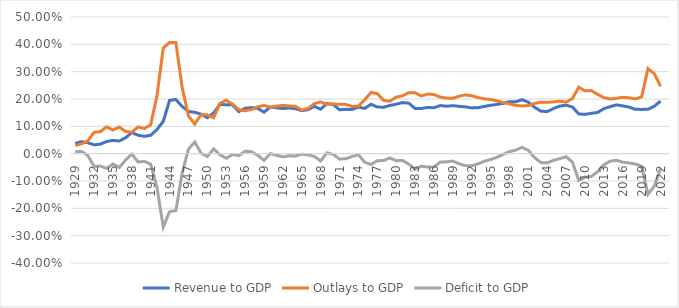
| Category | Revenue to GDP | Outlays to GDP | Deficit to GDP |
|---|---|---|---|
| 1929 | 0.037 | 0.03 | 0.007 |
| 1930 | 0.044 | 0.036 | 0.008 |
| 1931 | 0.04 | 0.046 | -0.006 |
| 1932 | 0.032 | 0.078 | -0.046 |
| 1933 | 0.035 | 0.08 | -0.045 |
| 1934 | 0.044 | 0.098 | -0.054 |
| 1935 | 0.049 | 0.086 | -0.038 |
| 1936 | 0.046 | 0.097 | -0.051 |
| 1937 | 0.058 | 0.082 | -0.024 |
| 1938 | 0.077 | 0.078 | -0.001 |
| 1939 | 0.067 | 0.098 | -0.03 |
| 1940 | 0.064 | 0.092 | -0.028 |
| 1941 | 0.067 | 0.106 | -0.038 |
| 1942 | 0.088 | 0.212 | -0.124 |
| 1943 | 0.118 | 0.387 | -0.269 |
| 1944 | 0.195 | 0.407 | -0.212 |
| 1945 | 0.198 | 0.407 | -0.209 |
| 1946 | 0.173 | 0.243 | -0.07 |
| 1947 | 0.154 | 0.138 | 0.016 |
| 1948 | 0.151 | 0.108 | 0.043 |
| 1949 | 0.145 | 0.143 | 0.002 |
| 1950 | 0.132 | 0.142 | -0.01 |
| 1951 | 0.149 | 0.131 | 0.018 |
| 1952 | 0.18 | 0.184 | -0.004 |
| 1953 | 0.179 | 0.196 | -0.017 |
| 1954 | 0.178 | 0.181 | -0.003 |
| 1955 | 0.154 | 0.161 | -0.007 |
| 1956 | 0.166 | 0.157 | 0.009 |
| 1957 | 0.169 | 0.162 | 0.007 |
| 1958 | 0.165 | 0.171 | -0.006 |
| 1959 | 0.152 | 0.177 | -0.025 |
| 1960 | 0.171 | 0.17 | 0.001 |
| 1961 | 0.168 | 0.174 | -0.006 |
| 1962 | 0.165 | 0.177 | -0.012 |
| 1963 | 0.167 | 0.175 | -0.007 |
| 1964 | 0.165 | 0.173 | -0.009 |
| 1965 | 0.157 | 0.159 | -0.002 |
| 1966 | 0.161 | 0.165 | -0.005 |
| 1967 | 0.173 | 0.183 | -0.01 |
| 1968 | 0.163 | 0.189 | -0.027 |
| 1969 | 0.184 | 0.18 | 0.003 |
| 1970 | 0.18 | 0.182 | -0.003 |
| 1971 | 0.161 | 0.18 | -0.02 |
| 1972 | 0.162 | 0.18 | -0.018 |
| 1973 | 0.162 | 0.172 | -0.01 |
| 1974 | 0.17 | 0.174 | -0.004 |
| 1975 | 0.166 | 0.197 | -0.032 |
| 1976 | 0.181 | 0.224 | -0.039 |
| 1977 | 0.171 | 0.22 | -0.026 |
| 1978 | 0.17 | 0.195 | -0.025 |
| 1979 | 0.176 | 0.192 | -0.016 |
| 1980 | 0.181 | 0.207 | -0.026 |
| 1981 | 0.187 | 0.211 | -0.025 |
| 1982 | 0.185 | 0.223 | -0.038 |
| 1983 | 0.165 | 0.222 | -0.057 |
| 1984 | 0.165 | 0.211 | -0.046 |
| 1985 | 0.169 | 0.218 | -0.049 |
| 1986 | 0.168 | 0.216 | -0.048 |
| 1987 | 0.176 | 0.207 | -0.031 |
| 1988 | 0.174 | 0.203 | -0.03 |
| 1989 | 0.176 | 0.203 | -0.027 |
| 1990 | 0.173 | 0.21 | -0.037 |
| 1991 | 0.171 | 0.215 | -0.044 |
| 1992 | 0.167 | 0.212 | -0.045 |
| 1993 | 0.168 | 0.205 | -0.037 |
| 1994 | 0.173 | 0.201 | -0.028 |
| 1995 | 0.177 | 0.198 | -0.021 |
| 1996 | 0.18 | 0.193 | -0.013 |
| 1997 | 0.184 | 0.187 | -0.003 |
| 1998 | 0.19 | 0.182 | 0.008 |
| 1999 | 0.19 | 0.177 | 0.013 |
| 2000 | 0.198 | 0.175 | 0.023 |
| 2001 | 0.188 | 0.176 | 0.012 |
| 2002 | 0.17 | 0.184 | -0.014 |
| 2003 | 0.156 | 0.189 | -0.033 |
| 2004 | 0.154 | 0.188 | -0.034 |
| 2005 | 0.165 | 0.19 | -0.024 |
| 2006 | 0.174 | 0.192 | -0.018 |
| 2007 | 0.177 | 0.189 | -0.011 |
| 2008 | 0.171 | 0.202 | -0.031 |
| 2009 | 0.145 | 0.243 | -0.098 |
| 2010 | 0.144 | 0.23 | -0.086 |
| 2011 | 0.148 | 0.231 | -0.083 |
| 2012 | 0.151 | 0.217 | -0.066 |
| 2013 | 0.165 | 0.205 | -0.04 |
| 2014 | 0.172 | 0.2 | -0.028 |
| 2015 | 0.179 | 0.203 | -0.024 |
| 2016 | 0.175 | 0.206 | -0.031 |
| 2017 | 0.17 | 0.204 | -0.034 |
| 2018 | 0.162 | 0.2 | -0.038 |
| 2019 | 0.162 | 0.208 | -0.046 |
| 2020 | 0.162 | 0.311 | -0.149 |
| 2021 | 0.174 | 0.293 | -0.119 |
| 2022 | 0.192 | 0.246 | -0.054 |